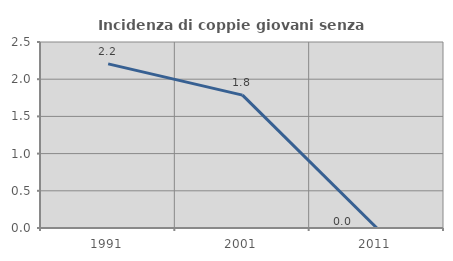
| Category | Incidenza di coppie giovani senza figli |
|---|---|
| 1991.0 | 2.206 |
| 2001.0 | 1.786 |
| 2011.0 | 0 |